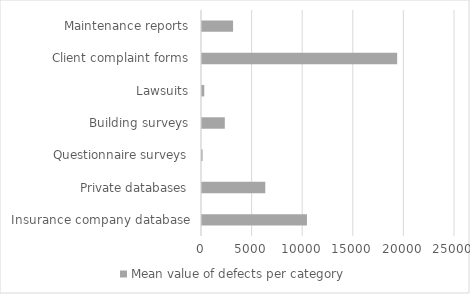
| Category | Mean value of defects per category |
|---|---|
| Insurance company database | 10371.333 |
| Private databases | 6252.923 |
| Questionnaire surveys | 61.375 |
| Building surveys | 2252.667 |
| Lawsuits | 222 |
| Client complaint forms | 19284.333 |
| Maintenance reports | 3069 |